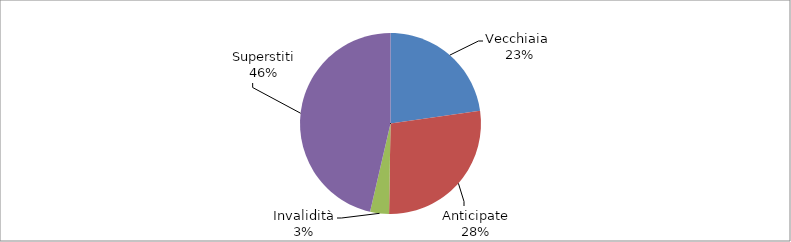
| Category | Series 0 |
|---|---|
| Vecchiaia  | 5748 |
| Anticipate | 6952 |
| Invalidità | 853 |
| Superstiti | 11720 |